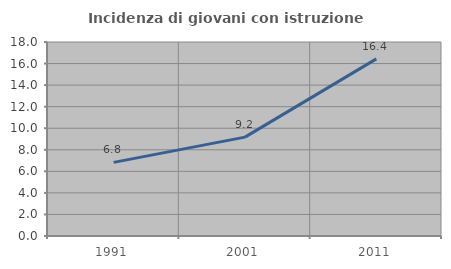
| Category | Incidenza di giovani con istruzione universitaria |
|---|---|
| 1991.0 | 6.831 |
| 2001.0 | 9.176 |
| 2011.0 | 16.434 |